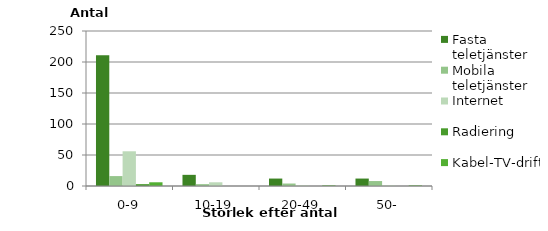
| Category | Fasta teletjänster | Mobila teletjänster | Internet | Radiering | Kabel-TV-drift |
|---|---|---|---|---|---|
| 0-9 | 211 | 16 | 56 | 3 | 6 |
| 10-19 | 18 | 3 | 6 | 0 | 0 |
| 20-49 | 12 | 4 | 1 | 0 | 1 |
| 50- | 12 | 8 | 1 | 0 | 1 |